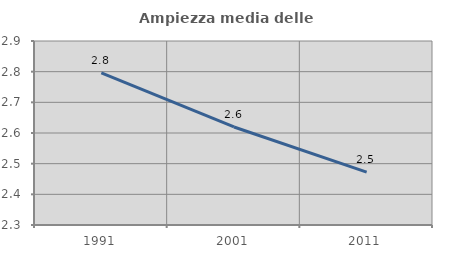
| Category | Ampiezza media delle famiglie |
|---|---|
| 1991.0 | 2.796 |
| 2001.0 | 2.62 |
| 2011.0 | 2.472 |